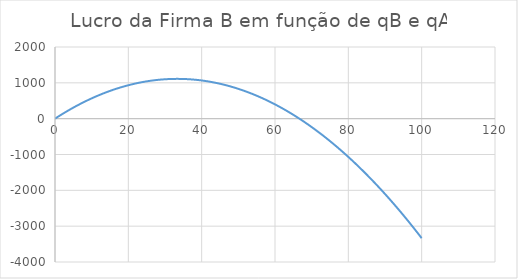
| Category | Series 0 |
|---|---|
| 0.0 | 0 |
| 1.0 | 65.65 |
| 2.0 | 129.3 |
| 3.0 | 190.95 |
| 4.0 | 250.6 |
| 5.0 | 308.25 |
| 6.0 | 363.9 |
| 7.0 | 417.55 |
| 8.0 | 469.2 |
| 9.0 | 518.85 |
| 10.0 | 566.5 |
| 11.0 | 612.15 |
| 12.0 | 655.8 |
| 13.0 | 697.45 |
| 14.0 | 737.1 |
| 15.0 | 774.75 |
| 16.0 | 810.4 |
| 17.0 | 844.05 |
| 18.0 | 875.7 |
| 19.0 | 905.35 |
| 20.0 | 933 |
| 21.0 | 958.65 |
| 22.0 | 982.3 |
| 23.0 | 1003.95 |
| 24.0 | 1023.6 |
| 25.0 | 1041.25 |
| 26.0 | 1056.9 |
| 27.0 | 1070.55 |
| 28.0 | 1082.2 |
| 29.0 | 1091.85 |
| 30.0 | 1099.5 |
| 31.0 | 1105.15 |
| 32.0 | 1108.8 |
| 33.0 | 1110.45 |
| 34.0 | 1110.1 |
| 35.0 | 1107.75 |
| 36.0 | 1103.4 |
| 37.0 | 1097.05 |
| 38.0 | 1088.7 |
| 39.0 | 1078.35 |
| 40.0 | 1066 |
| 41.0 | 1051.65 |
| 42.0 | 1035.3 |
| 43.0 | 1016.95 |
| 44.0 | 996.6 |
| 45.0 | 974.25 |
| 46.0 | 949.9 |
| 47.0 | 923.55 |
| 48.0 | 895.2 |
| 49.0 | 864.85 |
| 50.0 | 832.5 |
| 51.0 | 798.15 |
| 52.0 | 761.8 |
| 53.0 | 723.45 |
| 54.0 | 683.1 |
| 55.0 | 640.75 |
| 56.0 | 596.4 |
| 57.0 | 550.05 |
| 58.0 | 501.7 |
| 59.0 | 451.35 |
| 60.0 | 399 |
| 61.0 | 344.65 |
| 62.0 | 288.3 |
| 63.0 | 229.95 |
| 64.0 | 169.6 |
| 65.0 | 107.25 |
| 66.0 | 42.9 |
| 67.0 | -23.45 |
| 68.0 | -91.8 |
| 69.0 | -162.15 |
| 70.0 | -234.5 |
| 71.0 | -308.85 |
| 72.0 | -385.2 |
| 73.0 | -463.55 |
| 74.0 | -543.9 |
| 75.0 | -626.25 |
| 76.0 | -710.6 |
| 77.0 | -796.95 |
| 78.0 | -885.3 |
| 79.0 | -975.65 |
| 80.0 | -1068 |
| 81.0 | -1162.35 |
| 82.0 | -1258.7 |
| 83.0 | -1357.05 |
| 84.0 | -1457.4 |
| 85.0 | -1559.75 |
| 86.0 | -1664.1 |
| 87.0 | -1770.45 |
| 88.0 | -1878.8 |
| 89.0 | -1989.15 |
| 90.0 | -2101.5 |
| 91.0 | -2215.85 |
| 92.0 | -2332.2 |
| 93.0 | -2450.55 |
| 94.0 | -2570.9 |
| 95.0 | -2693.25 |
| 96.0 | -2817.6 |
| 97.0 | -2943.95 |
| 98.0 | -3072.3 |
| 99.0 | -3202.65 |
| 100.0 | -3335 |